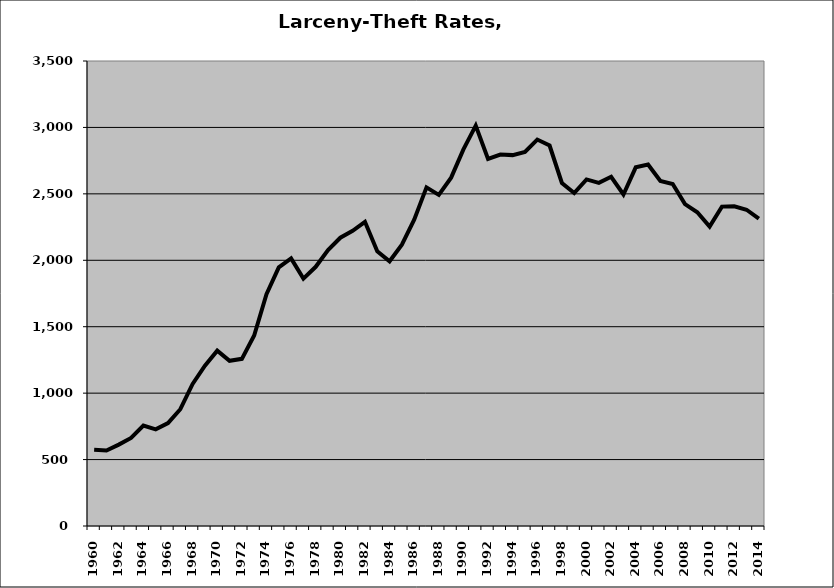
| Category | Larceny-Theft |
|---|---|
| 1960.0 | 573.821 |
| 1961.0 | 568.225 |
| 1962.0 | 612.671 |
| 1963.0 | 662.809 |
| 1964.0 | 756.441 |
| 1965.0 | 727.245 |
| 1966.0 | 774.425 |
| 1967.0 | 879.116 |
| 1968.0 | 1068.887 |
| 1969.0 | 1206.466 |
| 1970.0 | 1320.026 |
| 1971.0 | 1243.467 |
| 1972.0 | 1258.392 |
| 1973.0 | 1433.677 |
| 1974.0 | 1745.344 |
| 1975.0 | 1947.023 |
| 1976.0 | 2013.94 |
| 1977.0 | 1862.127 |
| 1978.0 | 1950.915 |
| 1979.0 | 2076.468 |
| 1980.0 | 2169.755 |
| 1981.0 | 2221.404 |
| 1982.0 | 2289.393 |
| 1983.0 | 2067.869 |
| 1984.0 | 1992.635 |
| 1985.0 | 2117.719 |
| 1986.0 | 2305.101 |
| 1987.0 | 2548.66 |
| 1988.0 | 2492.279 |
| 1989.0 | 2621.945 |
| 1990.0 | 2834.445 |
| 1991.0 | 3013.786 |
| 1992.0 | 2763.151 |
| 1993.0 | 2795.668 |
| 1994.0 | 2791.602 |
| 1995.0 | 2815.419 |
| 1996.0 | 2908.765 |
| 1997.0 | 2863.773 |
| 1998.0 | 2581.757 |
| 1999.0 | 2505.592 |
| 2000.0 | 2608.663 |
| 2001.0 | 2582.479 |
| 2002.0 | 2628.306 |
| 2003.0 | 2495.111 |
| 2004.0 | 2699.709 |
| 2005.0 | 2720.387 |
| 2006.0 | 2596.703 |
| 2007.0 | 2574.611 |
| 2008.0 | 2422.863 |
| 2009.0 | 2361.28 |
| 2010.0 | 2253.836 |
| 2011.0 | 2404.051 |
| 2012.0 | 2406.31 |
| 2013.0 | 2380.385 |
| 2014.0 | 2313.502 |